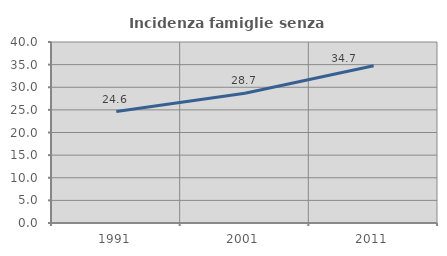
| Category | Incidenza famiglie senza nuclei |
|---|---|
| 1991.0 | 24.628 |
| 2001.0 | 28.662 |
| 2011.0 | 34.737 |